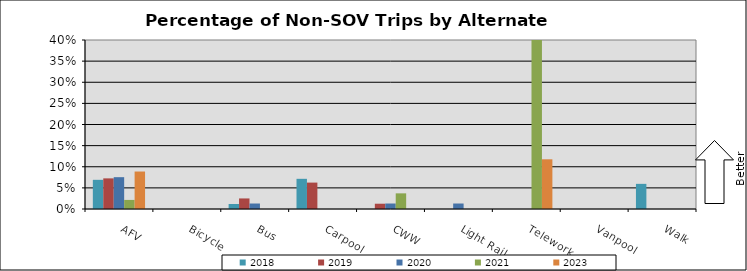
| Category | 2018 | 2019 | 2020 | 2021 | 2023 |
|---|---|---|---|---|---|
| AFV | 0.069 | 0.072 | 0.075 | 0.021 | 0.089 |
| Bicycle | 0 | 0 | 0 | 0 | 0 |
| Bus | 0.012 | 0.025 | 0.013 | 0 | 0 |
| Carpool | 0.071 | 0.062 | 0 | 0 | 0 |
| CWW | 0 | 0.012 | 0.013 | 0.037 | 0 |
| Light Rail | 0 | 0 | 0.013 | 0 | 0 |
| Telework | 0 | 0 | 0 | 0.537 | 0.118 |
| Vanpool | 0 | 0 | 0 | 0 | 0 |
| Walk | 0.06 | 0 | 0 | 0 | 0 |